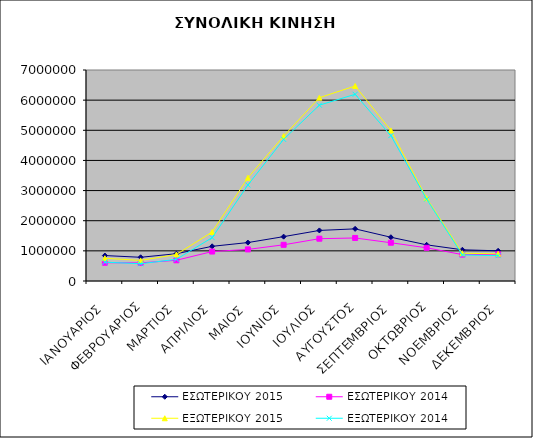
| Category | ΕΣΩΤΕΡΙΚΟΥ 2015 | ΕΣΩΤΕΡΙΚΟΥ 2014 | ΕΞΩΤΕΡΙΚΟΥ 2015 | ΕΞΩΤΕΡΙΚΟΥ 2014 |
|---|---|---|---|---|
| ΙΑΝΟΥΑΡΙΟΣ | 844240 | 605894 | 754299 | 625045 |
| ΦΕΒΡΟΥΑΡΙΟΣ | 786696 | 601285 | 682203 | 571905 |
| ΜΑΡΤΙΟΣ | 904804 | 686964 | 879061 | 719389 |
| ΑΠΡΙΛΙΟΣ | 1150732 | 977628 | 1624854 | 1438399 |
| ΜΑΙΟΣ | 1274767 | 1048085 | 3423898 | 3185210 |
| ΙΟΥΝΙΟΣ | 1471679 | 1200545 | 4805825 | 4699237 |
| ΙΟΥΛΙΟΣ | 1677449 | 1403252 | 6080592 | 5832928 |
| ΑΥΓΟΥΣΤΟΣ | 1729657 | 1427189 | 6469271 | 6193839 |
| ΣΕΠΤΕΜΒΡΙΟΣ | 1451763 | 1269365 | 4995242 | 4823076 |
| ΟΚΤΩΒΡΙΟΣ | 1199989 | 1101704 | 2744792 | 2715213 |
| ΝΟΕΜΒΡΙΟΣ | 1035216 | 875238 | 921451 | 864810 |
| ΔΕΚΕΜΒΡΙΟΣ | 1001882 | 883832 | 901238 | 842242 |